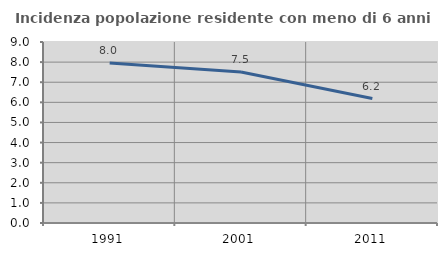
| Category | Incidenza popolazione residente con meno di 6 anni |
|---|---|
| 1991.0 | 7.96 |
| 2001.0 | 7.504 |
| 2011.0 | 6.191 |